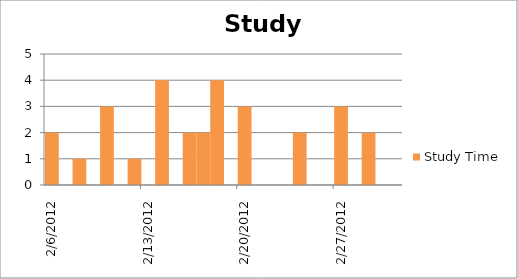
| Category | Study Time |
|---|---|
| 2/6/12 | 2 |
| 2/8/12 | 1 |
| 2/10/12 | 3 |
| 2/12/12 | 1 |
| 2/14/12 | 4 |
| 2/16/12 | 2 |
| 2/17/12 | 2 |
| 2/18/12 | 4 |
| 2/20/12 | 3 |
| 2/22/12 | 0 |
| 2/24/12 | 2 |
| 2/27/12 | 3 |
| 2/29/12 | 2 |
| 3/1/12 | 0 |
| 3/2/12 | 0 |